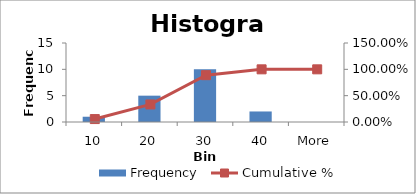
| Category | Frequency |
|---|---|
| 10 | 1 |
| 20 | 5 |
| 30 | 10 |
| 40 | 2 |
| More | 0 |